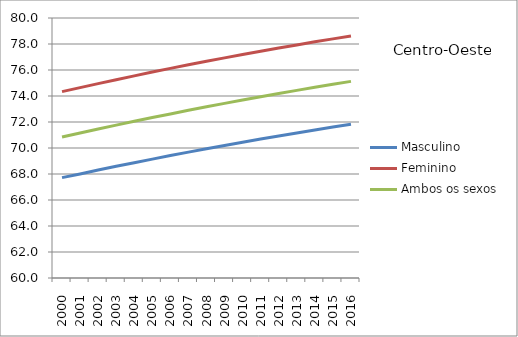
| Category | Masculino | Feminino | Ambos os sexos |
|---|---|---|---|
| 2000.0 | 67.719 | 74.334 | 70.842 |
| 2001.0 | 68.007 | 74.643 | 71.147 |
| 2002.0 | 68.302 | 74.954 | 71.456 |
| 2003.0 | 68.59 | 75.254 | 71.757 |
| 2004.0 | 68.87 | 75.549 | 72.051 |
| 2005.0 | 69.146 | 75.839 | 72.339 |
| 2006.0 | 69.416 | 76.123 | 72.622 |
| 2007.0 | 69.681 | 76.399 | 72.898 |
| 2008.0 | 69.94 | 76.671 | 73.169 |
| 2009.0 | 70.193 | 76.933 | 73.432 |
| 2010.0 | 70.444 | 77.197 | 73.694 |
| 2011.0 | 70.688 | 77.448 | 73.946 |
| 2012.0 | 70.925 | 77.693 | 74.191 |
| 2013.0 | 71.159 | 77.931 | 74.431 |
| 2014.0 | 71.386 | 78.169 | 74.668 |
| 2015.0 | 71.612 | 78.395 | 74.898 |
| 2016.0 | 71.832 | 78.619 | 75.124 |